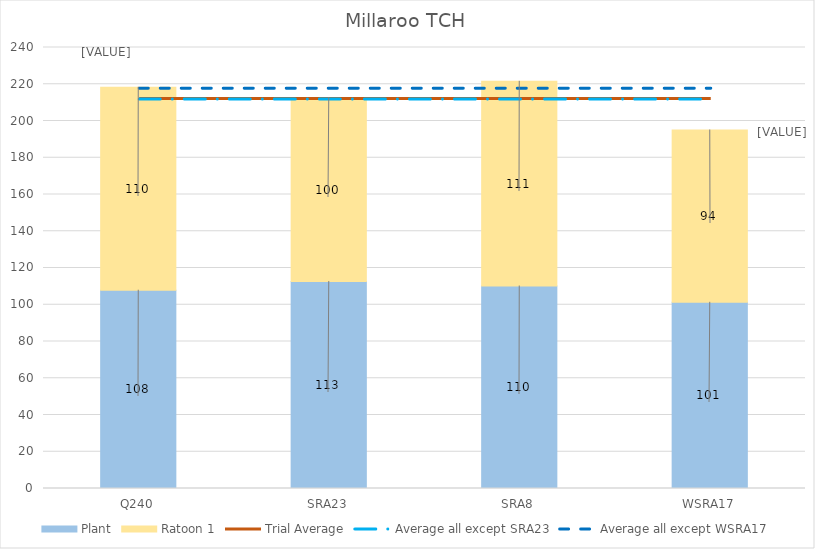
| Category | Plant | Ratoon 1 |
|---|---|---|
| Q240 | 107.909 | 110.438 |
| SRA23 | 112.669 | 100.095 |
| SRA8 | 110.203 | 111.39 |
| WSRA17 | 101.333 | 93.752 |